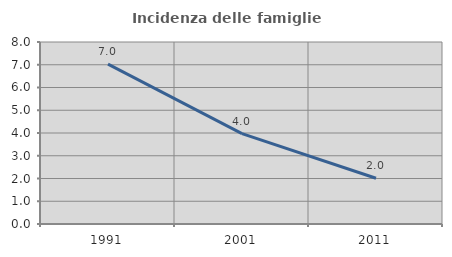
| Category | Incidenza delle famiglie numerose |
|---|---|
| 1991.0 | 7.026 |
| 2001.0 | 3.972 |
| 2011.0 | 2.012 |